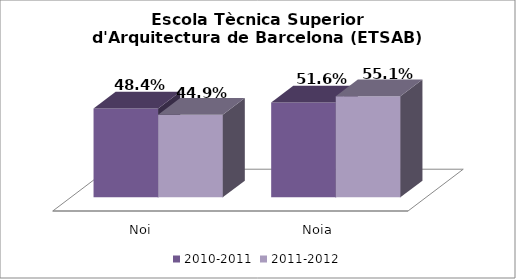
| Category | 2010-2011 | 2011-2012 |
|---|---|---|
| Noi | 0.484 | 0.449 |
| Noia | 0.516 | 0.551 |